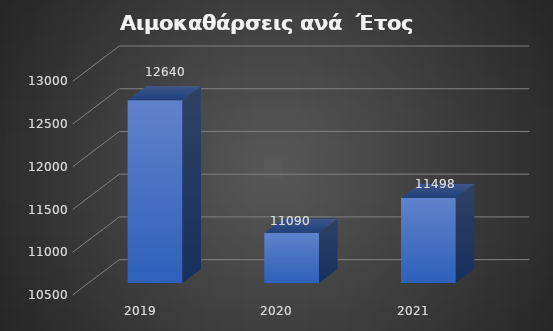
| Category | ΑΙΜΟΚΑΘΑΡΣΕΙΣ ΑΝΑ  ΕΤΟΣ |
|---|---|
| 2019.0 | 12640 |
| 2020.0 | 11090 |
| 2021.0 | 11498 |